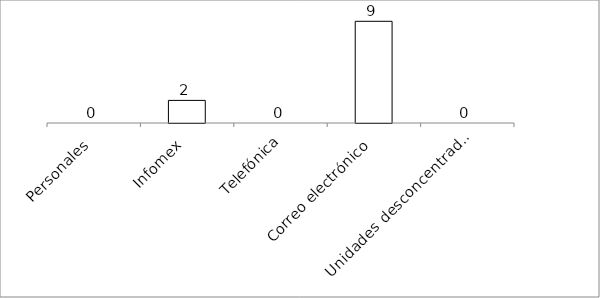
| Category | Series 0 |
|---|---|
| Personales | 0 |
| Infomex | 2 |
| Telefónica | 0 |
| Correo electrónico | 9 |
| Unidades desconcentradas | 0 |